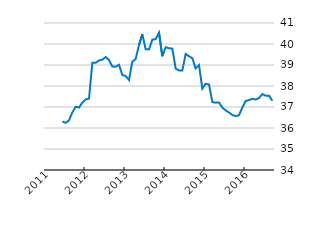
| Category | Series 0 |
|---|---|
| 2016-09-30 | 37297.07 |
| 2016-08-31 | 37541.77 |
| 2016-07-31 | 37536.14 |
| 2016-06-30 | 37616.31 |
| 2016-05-31 | 37421.94 |
| 2016-04-30 | 37356.34 |
| 2016-03-31 | 37390.42 |
| 2016-02-29 | 37326.57 |
| 2016-01-31 | 37287.88 |
| 2015-12-31 | 36975.13 |
| 2015-11-30 | 36606.01 |
| 2015-10-31 | 36570.22 |
| 2015-09-30 | 36618.05 |
| 2015-08-31 | 36741.97 |
| 2015-07-31 | 36836.35 |
| 2015-06-30 | 36970.94 |
| 2015-05-31 | 37216.35 |
| 2015-04-30 | 37206.93 |
| 2015-03-31 | 37236.43 |
| 2015-02-28 | 38076.07 |
| 2015-01-31 | 38108.75 |
| 2014-12-31 | 37873.42 |
| 2014-11-30 | 38996.63 |
| 2014-10-31 | 38837.91 |
| 2014-09-30 | 39320.57 |
| 2014-08-31 | 39419.46 |
| 2014-07-31 | 39527.25 |
| 2014-06-30 | 38742.83 |
| 2014-05-31 | 38741.43 |
| 2014-04-30 | 38823.95 |
| 2014-03-31 | 39780.58 |
| 2014-02-28 | 39799.69 |
| 2014-01-31 | 39846.06 |
| 2013-12-31 | 39413.73 |
| 2013-11-30 | 40543.8 |
| 2013-10-31 | 40231.99 |
| 2013-09-30 | 40206.3 |
| 2013-08-31 | 39742.08 |
| 2013-07-31 | 39749.69 |
| 2013-06-30 | 40473.64 |
| 2013-05-31 | 39955.9 |
| 2013-04-30 | 39284.46 |
| 2013-03-31 | 39156.25 |
| 2013-02-28 | 38286.11 |
| 2013-01-31 | 38474.34 |
| 2012-12-31 | 38523.1 |
| 2012-11-30 | 39012.52 |
| 2012-10-31 | 38917.29 |
| 2012-09-30 | 38929.45 |
| 2012-08-31 | 39237.17 |
| 2012-07-31 | 39381.11 |
| 2012-06-30 | 39249.81 |
| 2012-05-31 | 39216.6 |
| 2012-04-30 | 39104.61 |
| 2012-03-31 | 39105.38 |
| 2012-02-29 | 37398.15 |
| 2012-01-31 | 37360.35 |
| 2011-12-31 | 37209.44 |
| 2011-11-30 | 36972.91 |
| 2011-10-31 | 37015.09 |
| 2011-09-30 | 36736.98 |
| 2011-08-31 | 36362.61 |
| 2011-07-31 | 36247.97 |
| 2011-06-30 | 36307.85 |